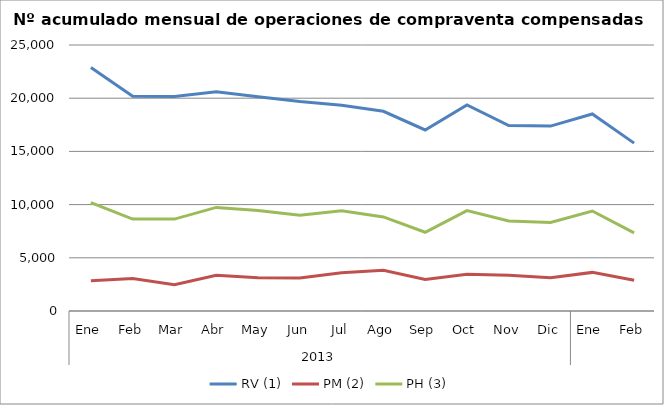
| Category | RV (1) | PM (2) | PH (3) |
|---|---|---|---|
| 0 | 22894 | 2853 | 10176 |
| 1 | 20174 | 3047 | 8641 |
| 2 | 20169 | 2472 | 8638 |
| 3 | 20616 | 3350 | 9736 |
| 4 | 20126 | 3117 | 9441 |
| 5 | 19686 | 3099 | 9000 |
| 6 | 19337 | 3588 | 9415 |
| 7 | 18769 | 3829 | 8838 |
| 8 | 17015 | 2969 | 7402 |
| 9 | 19371 | 3453 | 9435 |
| 10 | 17427 | 3359 | 8465 |
| 11 | 17377 | 3135 | 8315 |
| 12 | 18515 | 3629 | 9396 |
| 13 | 15776 | 2899 | 7337 |